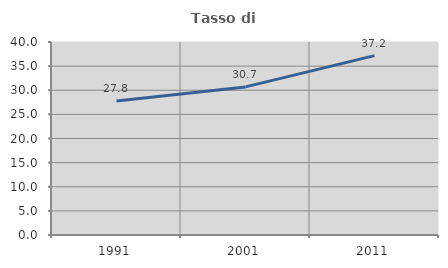
| Category | Tasso di occupazione   |
|---|---|
| 1991.0 | 27.787 |
| 2001.0 | 30.696 |
| 2011.0 | 37.178 |